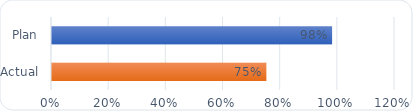
| Category | Progress |
|---|---|
| Plan | 0.98 |
| Actual | 0.75 |